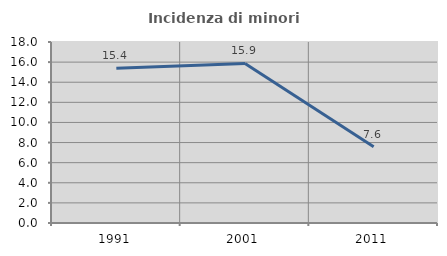
| Category | Incidenza di minori stranieri |
|---|---|
| 1991.0 | 15.385 |
| 2001.0 | 15.873 |
| 2011.0 | 7.576 |